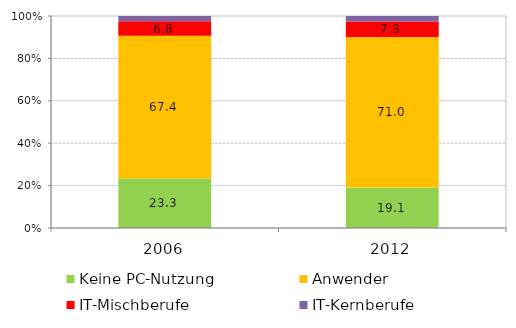
| Category | Keine PC-Nutzung | Anwender | IT-Mischberufe | IT-Kernberufe |
|---|---|---|---|---|
| 2006.0 | 23.3 | 67.4 | 6.8 | 2.5 |
| 2012.0 | 19.1 | 71 | 7.3 | 2.6 |